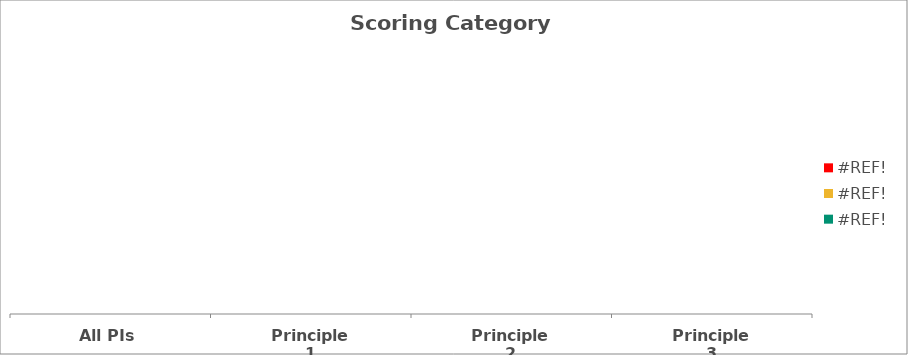
| Category | #REF! |
|---|---|
| All PIs | 0 |
| Principle 1 | 0 |
| Principle 2 | 0 |
| Principle 3 | 0 |